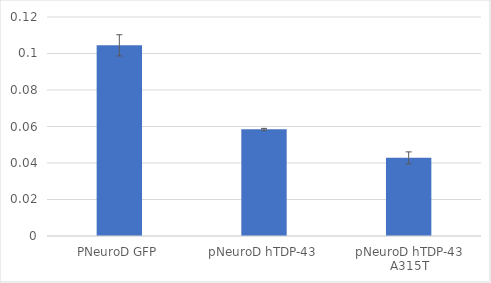
| Category | Series 0 |
|---|---|
| PNeuroD GFP | 0.104 |
| pNeuroD hTDP-43 | 0.058 |
| pNeuroD hTDP-43 A315T | 0.043 |